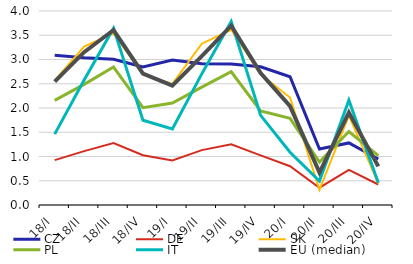
| Category | CZ | DE | SK | PL | IT | EU (median) |
|---|---|---|---|---|---|---|
| 18/I | 3.088 | 0.925 | 2.568 | 2.156 | 1.462 | 2.545 |
| 18/II | 3.038 | 1.11 | 3.265 | 2.488 | 2.577 | 3.151 |
| 18/III | 3.004 | 1.275 | 3.539 | 2.844 | 3.646 | 3.608 |
| 18/IV | 2.844 | 1.025 | 2.694 | 2.005 | 1.746 | 2.708 |
| 19/I | 2.989 | 0.919 | 2.497 | 2.101 | 1.568 | 2.463 |
| 19/II | 2.914 | 1.132 | 3.326 | 2.43 | 2.703 | 3.068 |
| 19/III | 2.909 | 1.254 | 3.613 | 2.748 | 3.784 | 3.699 |
| 19/IV | 2.849 | 1.023 | 2.692 | 1.939 | 1.849 | 2.718 |
| 20/I | 2.645 | 0.8 | 2.216 | 1.785 | 1.087 | 2.037 |
| 20/II | 1.156 | 0.356 | 0.312 | 0.886 | 0.496 | 0.667 |
| 20/III | 1.28 | 0.722 | 1.845 | 1.515 | 2.16 | 1.906 |
| 20/IV | 0.949 | 0.423 | 0.447 | 1.019 | 0.458 | 0.796 |